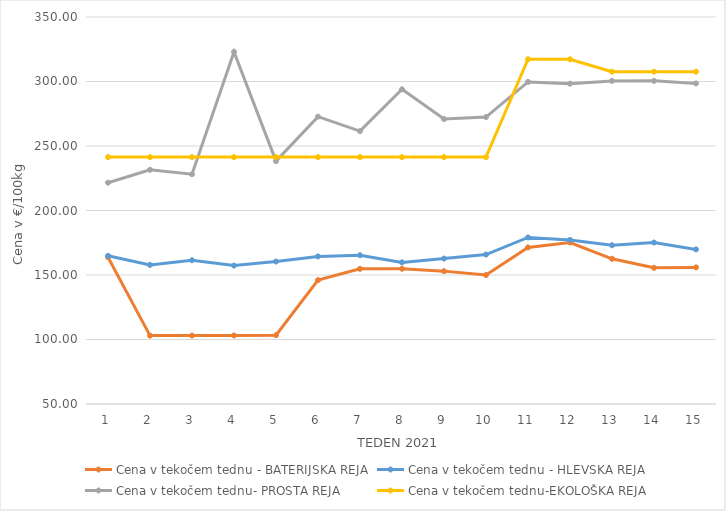
| Category | Cena v tekočem tednu - BATERIJSKA REJA | Cena v tekočem tednu - HLEVSKA REJA | Cena v tekočem tednu- PROSTA REJA | Cena v tekočem tednu-EKOLOŠKA REJA |
|---|---|---|---|---|
| 1.0 | 163.81 | 164.86 | 221.55 | 241.38 |
| 2.0 | 103.02 | 157.81 | 231.55 | 241.38 |
| 3.0 | 103.03 | 161.48 | 228.1 | 241.38 |
| 4.0 | 103.15 | 157.29 | 322.93 | 241.38 |
| 5.0 | 103.34 | 160.43 | 238.28 | 241.38 |
| 6.0 | 146.03 | 164.39 | 272.76 | 241.38 |
| 7.0 | 154.77 | 165.34 | 261.55 | 241.38 |
| 8.0 | 154.86 | 159.79 | 293.97 | 241.38 |
| 9.0 | 153 | 162.73 | 270.86 | 241.38 |
| 10.0 | 149.98 | 165.85 | 272.41 | 241.38 |
| 11.0 | 171.4 | 179.09 | 299.66 | 317.24 |
| 12.0 | 175.2 | 177.21 | 298.27 | 317.24 |
| 13.0 | 162.57 | 173.07 | 300.45 | 307.59 |
| 14.0 | 155.55 | 175.17 | 300.49 | 307.59 |
| 15.0 | 155.88 | 169.83 | 298.52 | 307.59 |